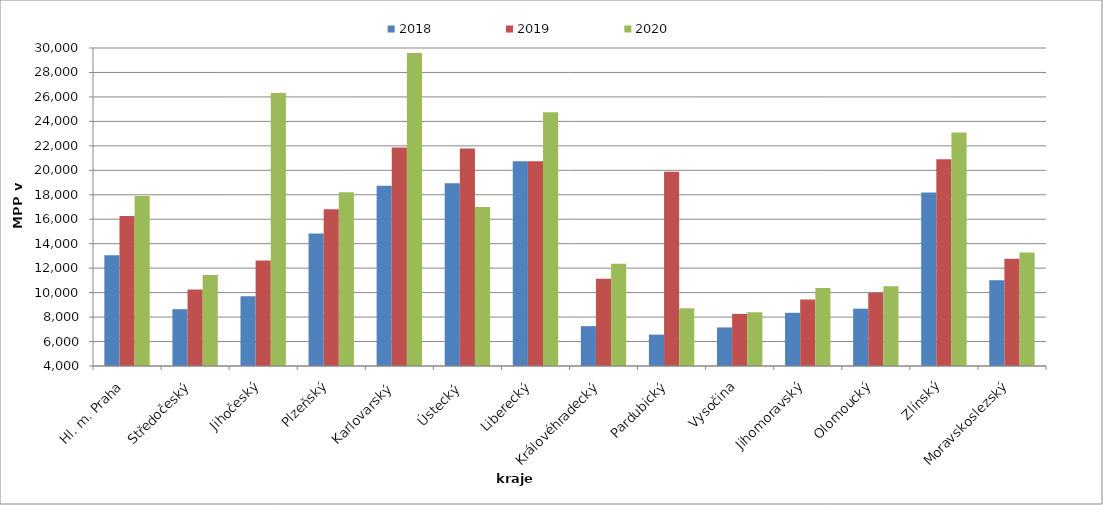
| Category | 2018 | 2019 | 2020 |
|---|---|---|---|
| Hl. m. Praha | 13064.844 | 16270.857 | 17896.127 |
| Středočeský | 8645.986 | 10258.571 | 11437.714 |
| Jihočeský | 9703.864 | 12622.089 | 26312.105 |
| Plzeňský | 14830.557 | 16822.43 | 18211.134 |
| Karlovarský  | 18733.333 | 21866.667 | 29600 |
| Ústecký   | 18937.253 | 21777.804 | 17000.435 |
| Liberecký | 20738.479 | 20738.479 | 24745.275 |
| Královéhradecký | 7259.203 | 11131.628 | 12356.255 |
| Pardubický | 6567.12 | 19888.37 | 8717.297 |
| Vysočina | 7153.394 | 8262.15 | 8392.495 |
| Jihomoravský | 8350.89 | 9430.197 | 10375.491 |
| Olomoucký | 8688.358 | 9991.642 | 10529.429 |
| Zlínský | 18181.273 | 20900.288 | 23096.467 |
| Moravskoslezský | 11010.927 | 12771.776 | 13284.552 |